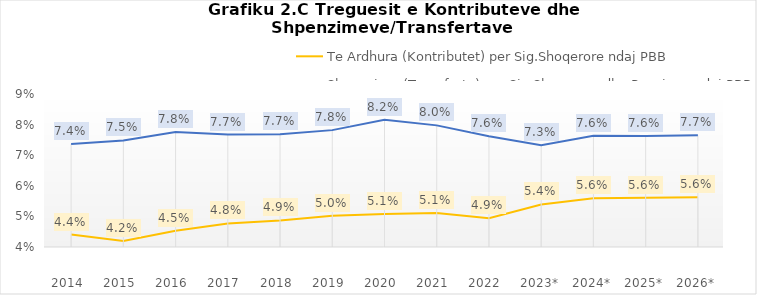
| Category | Te Ardhura (Kontributet) per Sig.Shoqerore ndaj PBB  | Shpenzime (Transferta) per Sig.Shoqerore dhe Pensione ndaj PBB  |
|---|---|---|
| 2014  | 0.044 | 0.074 |
| 2015  | 0.042 | 0.075 |
| 2016  | 0.045 | 0.078 |
| 2017  | 0.048 | 0.077 |
| 2018  | 0.049 | 0.077 |
| 2019  | 0.05 | 0.078 |
| 2020  | 0.051 | 0.082 |
| 2021  | 0.051 | 0.08 |
| 2022  | 0.049 | 0.076 |
| 2023* | 0.054 | 0.073 |
| 2024* | 0.056 | 0.076 |
| 2025* | 0.056 | 0.076 |
| 2026* | 0.056 | 0.077 |